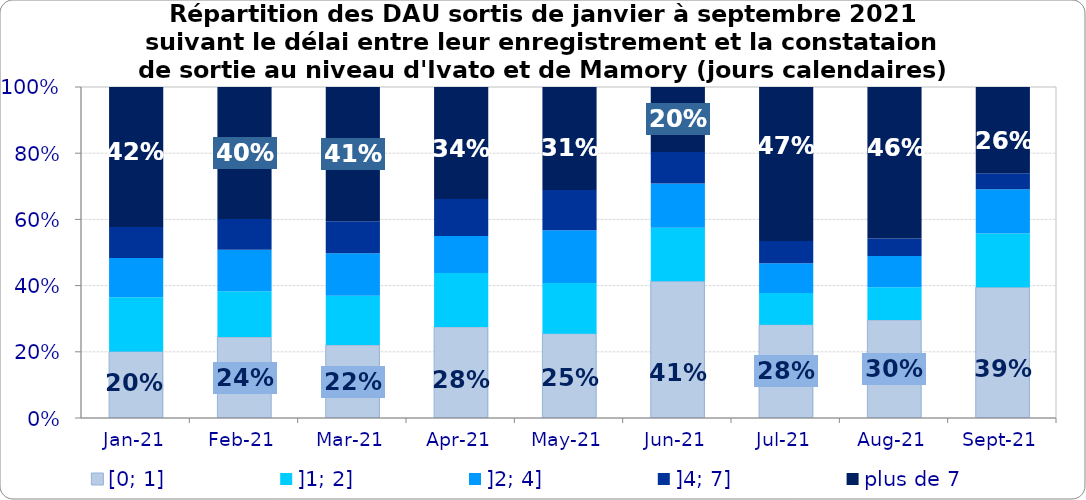
| Category | [0; 1] | ]1; 2] | ]2; 4] | ]4; 7] | plus de 7 |
|---|---|---|---|---|---|
| 2021-01-01 | 0.201 | 0.164 | 0.118 | 0.093 | 0.423 |
| 2021-02-01 | 0.244 | 0.138 | 0.126 | 0.093 | 0.399 |
| 2021-03-01 | 0.22 | 0.149 | 0.128 | 0.097 | 0.406 |
| 2021-04-01 | 0.275 | 0.163 | 0.112 | 0.112 | 0.339 |
| 2021-05-01 | 0.255 | 0.153 | 0.159 | 0.122 | 0.311 |
| 2021-06-01 | 0.413 | 0.161 | 0.133 | 0.096 | 0.196 |
| 2021-07-01 | 0.282 | 0.095 | 0.09 | 0.067 | 0.465 |
| 2021-08-01 | 0.296 | 0.099 | 0.094 | 0.054 | 0.457 |
| 2021-09-01 | 0.395 | 0.162 | 0.134 | 0.048 | 0.261 |